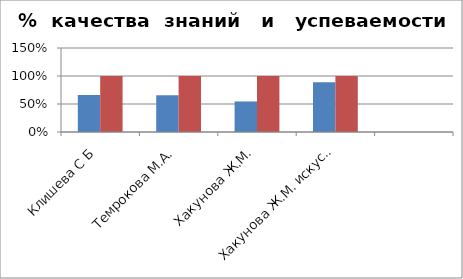
| Category | Series 0 | 2 |
|---|---|---|
| Клишева С Б | 0.66 | 1 |
| Темрокова М.А. | 0.656 | 1 |
| Хакунова Ж.М. | 0.545 | 1 |
| Хакунова Ж.М. искусство | 0.887 | 1 |